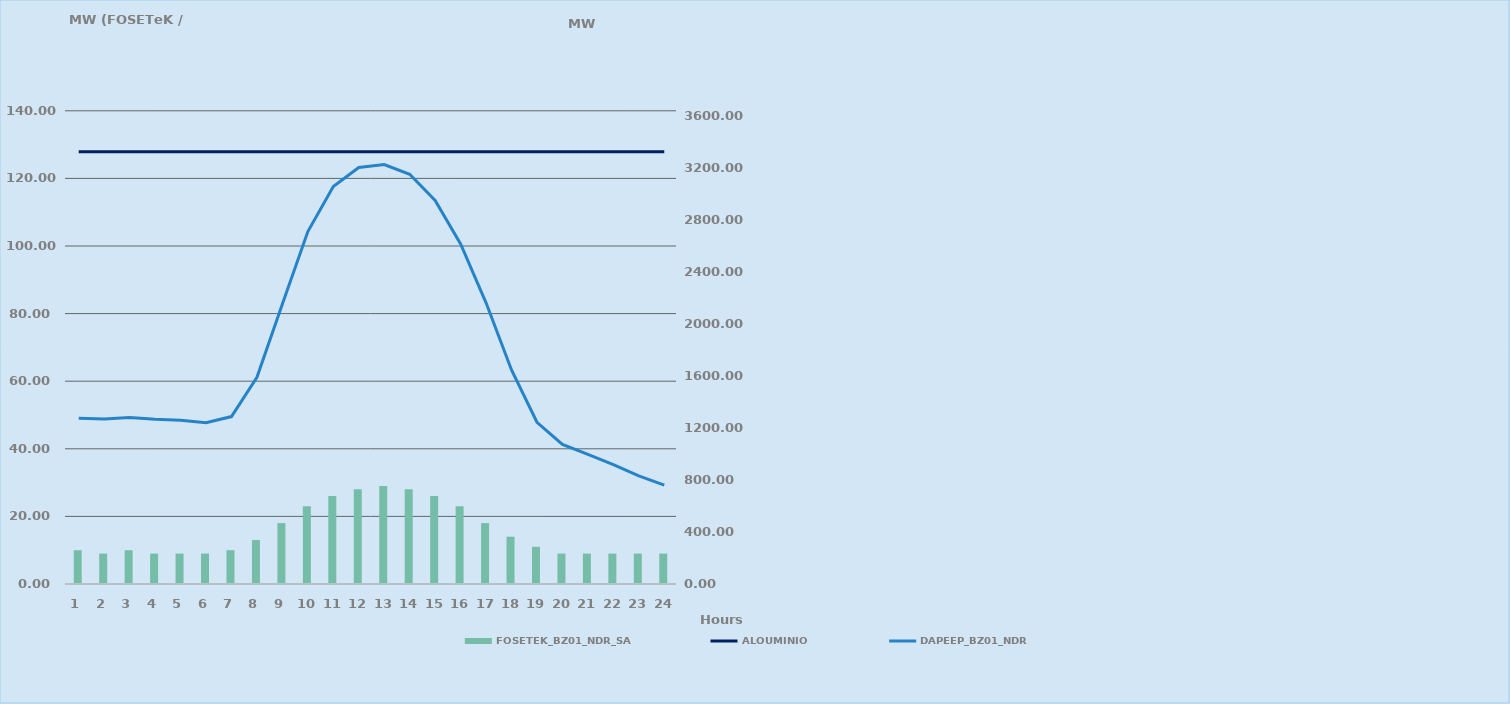
| Category | FOSETEK_BZ01_NDR_SA |
|---|---|
| 0 | 10 |
| 1 | 9 |
| 2 | 10 |
| 3 | 9 |
| 4 | 9 |
| 5 | 9 |
| 6 | 10 |
| 7 | 13 |
| 8 | 18 |
| 9 | 23 |
| 10 | 26 |
| 11 | 28 |
| 12 | 29 |
| 13 | 28 |
| 14 | 26 |
| 15 | 23 |
| 16 | 18 |
| 17 | 14 |
| 18 | 11 |
| 19 | 9 |
| 20 | 9 |
| 21 | 9 |
| 22 | 9 |
| 23 | 9 |